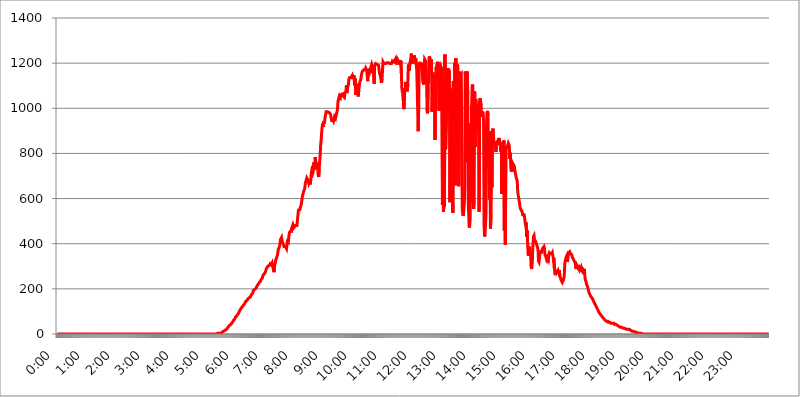
| Category | 2015.04.27. Intenzitás [W/m^2] |
|---|---|
| 0.0 | 0 |
| 0.0006944444444444445 | 0 |
| 0.001388888888888889 | 0 |
| 0.0020833333333333333 | 0 |
| 0.002777777777777778 | 0 |
| 0.003472222222222222 | 0 |
| 0.004166666666666667 | 0 |
| 0.004861111111111111 | 0 |
| 0.005555555555555556 | 0 |
| 0.0062499999999999995 | 0 |
| 0.006944444444444444 | 0 |
| 0.007638888888888889 | 0 |
| 0.008333333333333333 | 0 |
| 0.009027777777777779 | 0 |
| 0.009722222222222222 | 0 |
| 0.010416666666666666 | 0 |
| 0.011111111111111112 | 0 |
| 0.011805555555555555 | 0 |
| 0.012499999999999999 | 0 |
| 0.013194444444444444 | 0 |
| 0.013888888888888888 | 0 |
| 0.014583333333333332 | 0 |
| 0.015277777777777777 | 0 |
| 0.015972222222222224 | 0 |
| 0.016666666666666666 | 0 |
| 0.017361111111111112 | 0 |
| 0.018055555555555557 | 0 |
| 0.01875 | 0 |
| 0.019444444444444445 | 0 |
| 0.02013888888888889 | 0 |
| 0.020833333333333332 | 0 |
| 0.02152777777777778 | 0 |
| 0.022222222222222223 | 0 |
| 0.02291666666666667 | 0 |
| 0.02361111111111111 | 0 |
| 0.024305555555555556 | 0 |
| 0.024999999999999998 | 0 |
| 0.025694444444444447 | 0 |
| 0.02638888888888889 | 0 |
| 0.027083333333333334 | 0 |
| 0.027777777777777776 | 0 |
| 0.02847222222222222 | 0 |
| 0.029166666666666664 | 0 |
| 0.029861111111111113 | 0 |
| 0.030555555555555555 | 0 |
| 0.03125 | 0 |
| 0.03194444444444445 | 0 |
| 0.03263888888888889 | 0 |
| 0.03333333333333333 | 0 |
| 0.034027777777777775 | 0 |
| 0.034722222222222224 | 0 |
| 0.035416666666666666 | 0 |
| 0.036111111111111115 | 0 |
| 0.03680555555555556 | 0 |
| 0.0375 | 0 |
| 0.03819444444444444 | 0 |
| 0.03888888888888889 | 0 |
| 0.03958333333333333 | 0 |
| 0.04027777777777778 | 0 |
| 0.04097222222222222 | 0 |
| 0.041666666666666664 | 0 |
| 0.042361111111111106 | 0 |
| 0.04305555555555556 | 0 |
| 0.043750000000000004 | 0 |
| 0.044444444444444446 | 0 |
| 0.04513888888888889 | 0 |
| 0.04583333333333334 | 0 |
| 0.04652777777777778 | 0 |
| 0.04722222222222222 | 0 |
| 0.04791666666666666 | 0 |
| 0.04861111111111111 | 0 |
| 0.049305555555555554 | 0 |
| 0.049999999999999996 | 0 |
| 0.05069444444444445 | 0 |
| 0.051388888888888894 | 0 |
| 0.052083333333333336 | 0 |
| 0.05277777777777778 | 0 |
| 0.05347222222222222 | 0 |
| 0.05416666666666667 | 0 |
| 0.05486111111111111 | 0 |
| 0.05555555555555555 | 0 |
| 0.05625 | 0 |
| 0.05694444444444444 | 0 |
| 0.057638888888888885 | 0 |
| 0.05833333333333333 | 0 |
| 0.05902777777777778 | 0 |
| 0.059722222222222225 | 0 |
| 0.06041666666666667 | 0 |
| 0.061111111111111116 | 0 |
| 0.06180555555555556 | 0 |
| 0.0625 | 0 |
| 0.06319444444444444 | 0 |
| 0.06388888888888888 | 0 |
| 0.06458333333333334 | 0 |
| 0.06527777777777778 | 0 |
| 0.06597222222222222 | 0 |
| 0.06666666666666667 | 0 |
| 0.06736111111111111 | 0 |
| 0.06805555555555555 | 0 |
| 0.06874999999999999 | 0 |
| 0.06944444444444443 | 0 |
| 0.07013888888888889 | 0 |
| 0.07083333333333333 | 0 |
| 0.07152777777777779 | 0 |
| 0.07222222222222223 | 0 |
| 0.07291666666666667 | 0 |
| 0.07361111111111111 | 0 |
| 0.07430555555555556 | 0 |
| 0.075 | 0 |
| 0.07569444444444444 | 0 |
| 0.0763888888888889 | 0 |
| 0.07708333333333334 | 0 |
| 0.07777777777777778 | 0 |
| 0.07847222222222222 | 0 |
| 0.07916666666666666 | 0 |
| 0.0798611111111111 | 0 |
| 0.08055555555555556 | 0 |
| 0.08125 | 0 |
| 0.08194444444444444 | 0 |
| 0.08263888888888889 | 0 |
| 0.08333333333333333 | 0 |
| 0.08402777777777777 | 0 |
| 0.08472222222222221 | 0 |
| 0.08541666666666665 | 0 |
| 0.08611111111111112 | 0 |
| 0.08680555555555557 | 0 |
| 0.08750000000000001 | 0 |
| 0.08819444444444445 | 0 |
| 0.08888888888888889 | 0 |
| 0.08958333333333333 | 0 |
| 0.09027777777777778 | 0 |
| 0.09097222222222222 | 0 |
| 0.09166666666666667 | 0 |
| 0.09236111111111112 | 0 |
| 0.09305555555555556 | 0 |
| 0.09375 | 0 |
| 0.09444444444444444 | 0 |
| 0.09513888888888888 | 0 |
| 0.09583333333333333 | 0 |
| 0.09652777777777777 | 0 |
| 0.09722222222222222 | 0 |
| 0.09791666666666667 | 0 |
| 0.09861111111111111 | 0 |
| 0.09930555555555555 | 0 |
| 0.09999999999999999 | 0 |
| 0.10069444444444443 | 0 |
| 0.1013888888888889 | 0 |
| 0.10208333333333335 | 0 |
| 0.10277777777777779 | 0 |
| 0.10347222222222223 | 0 |
| 0.10416666666666667 | 0 |
| 0.10486111111111111 | 0 |
| 0.10555555555555556 | 0 |
| 0.10625 | 0 |
| 0.10694444444444444 | 0 |
| 0.1076388888888889 | 0 |
| 0.10833333333333334 | 0 |
| 0.10902777777777778 | 0 |
| 0.10972222222222222 | 0 |
| 0.1111111111111111 | 0 |
| 0.11180555555555556 | 0 |
| 0.11180555555555556 | 0 |
| 0.1125 | 0 |
| 0.11319444444444444 | 0 |
| 0.11388888888888889 | 0 |
| 0.11458333333333333 | 0 |
| 0.11527777777777777 | 0 |
| 0.11597222222222221 | 0 |
| 0.11666666666666665 | 0 |
| 0.1173611111111111 | 0 |
| 0.11805555555555557 | 0 |
| 0.11944444444444445 | 0 |
| 0.12013888888888889 | 0 |
| 0.12083333333333333 | 0 |
| 0.12152777777777778 | 0 |
| 0.12222222222222223 | 0 |
| 0.12291666666666667 | 0 |
| 0.12291666666666667 | 0 |
| 0.12361111111111112 | 0 |
| 0.12430555555555556 | 0 |
| 0.125 | 0 |
| 0.12569444444444444 | 0 |
| 0.12638888888888888 | 0 |
| 0.12708333333333333 | 0 |
| 0.16875 | 0 |
| 0.12847222222222224 | 0 |
| 0.12916666666666668 | 0 |
| 0.12986111111111112 | 0 |
| 0.13055555555555556 | 0 |
| 0.13125 | 0 |
| 0.13194444444444445 | 0 |
| 0.1326388888888889 | 0 |
| 0.13333333333333333 | 0 |
| 0.13402777777777777 | 0 |
| 0.13402777777777777 | 0 |
| 0.13472222222222222 | 0 |
| 0.13541666666666666 | 0 |
| 0.1361111111111111 | 0 |
| 0.13749999999999998 | 0 |
| 0.13819444444444443 | 0 |
| 0.1388888888888889 | 0 |
| 0.13958333333333334 | 0 |
| 0.14027777777777778 | 0 |
| 0.14097222222222222 | 0 |
| 0.14166666666666666 | 0 |
| 0.1423611111111111 | 0 |
| 0.14305555555555557 | 0 |
| 0.14375000000000002 | 0 |
| 0.14444444444444446 | 0 |
| 0.1451388888888889 | 0 |
| 0.1451388888888889 | 0 |
| 0.14652777777777778 | 0 |
| 0.14722222222222223 | 0 |
| 0.14791666666666667 | 0 |
| 0.1486111111111111 | 0 |
| 0.14930555555555555 | 0 |
| 0.15 | 0 |
| 0.15069444444444444 | 0 |
| 0.15138888888888888 | 0 |
| 0.15208333333333332 | 0 |
| 0.15277777777777776 | 0 |
| 0.15347222222222223 | 0 |
| 0.15416666666666667 | 0 |
| 0.15486111111111112 | 0 |
| 0.15555555555555556 | 0 |
| 0.15625 | 0 |
| 0.15694444444444444 | 0 |
| 0.15763888888888888 | 0 |
| 0.15833333333333333 | 0 |
| 0.15902777777777777 | 0 |
| 0.15972222222222224 | 0 |
| 0.16041666666666668 | 0 |
| 0.16111111111111112 | 0 |
| 0.16180555555555556 | 0 |
| 0.1625 | 0 |
| 0.16319444444444445 | 0 |
| 0.1638888888888889 | 0 |
| 0.16458333333333333 | 0 |
| 0.16527777777777777 | 0 |
| 0.16597222222222222 | 0 |
| 0.16666666666666666 | 0 |
| 0.1673611111111111 | 0 |
| 0.16805555555555554 | 0 |
| 0.16874999999999998 | 0 |
| 0.16944444444444443 | 0 |
| 0.17013888888888887 | 0 |
| 0.1708333333333333 | 0 |
| 0.17152777777777775 | 0 |
| 0.17222222222222225 | 0 |
| 0.1729166666666667 | 0 |
| 0.17361111111111113 | 0 |
| 0.17430555555555557 | 0 |
| 0.17500000000000002 | 0 |
| 0.17569444444444446 | 0 |
| 0.1763888888888889 | 0 |
| 0.17708333333333334 | 0 |
| 0.17777777777777778 | 0 |
| 0.17847222222222223 | 0 |
| 0.17916666666666667 | 0 |
| 0.1798611111111111 | 0 |
| 0.18055555555555555 | 0 |
| 0.18125 | 0 |
| 0.18194444444444444 | 0 |
| 0.1826388888888889 | 0 |
| 0.18333333333333335 | 0 |
| 0.1840277777777778 | 0 |
| 0.18472222222222223 | 0 |
| 0.18541666666666667 | 0 |
| 0.18611111111111112 | 0 |
| 0.18680555555555556 | 0 |
| 0.1875 | 0 |
| 0.18819444444444444 | 0 |
| 0.18888888888888888 | 0 |
| 0.18958333333333333 | 0 |
| 0.19027777777777777 | 0 |
| 0.1909722222222222 | 0 |
| 0.19166666666666665 | 0 |
| 0.19236111111111112 | 0 |
| 0.19305555555555554 | 0 |
| 0.19375 | 0 |
| 0.19444444444444445 | 0 |
| 0.1951388888888889 | 0 |
| 0.19583333333333333 | 0 |
| 0.19652777777777777 | 0 |
| 0.19722222222222222 | 0 |
| 0.19791666666666666 | 0 |
| 0.1986111111111111 | 0 |
| 0.19930555555555554 | 0 |
| 0.19999999999999998 | 0 |
| 0.20069444444444443 | 0 |
| 0.20138888888888887 | 0 |
| 0.2020833333333333 | 0 |
| 0.2027777777777778 | 0 |
| 0.2034722222222222 | 0 |
| 0.2041666666666667 | 0 |
| 0.20486111111111113 | 0 |
| 0.20555555555555557 | 0 |
| 0.20625000000000002 | 0 |
| 0.20694444444444446 | 0 |
| 0.2076388888888889 | 0 |
| 0.20833333333333334 | 0 |
| 0.20902777777777778 | 0 |
| 0.20972222222222223 | 0 |
| 0.21041666666666667 | 0 |
| 0.2111111111111111 | 0 |
| 0.21180555555555555 | 0 |
| 0.2125 | 0 |
| 0.21319444444444444 | 0 |
| 0.2138888888888889 | 0 |
| 0.21458333333333335 | 0 |
| 0.2152777777777778 | 0 |
| 0.21597222222222223 | 0 |
| 0.21666666666666667 | 0 |
| 0.21736111111111112 | 0 |
| 0.21805555555555556 | 0 |
| 0.21875 | 0 |
| 0.21944444444444444 | 0 |
| 0.22013888888888888 | 0 |
| 0.22083333333333333 | 0 |
| 0.22152777777777777 | 0 |
| 0.2222222222222222 | 0 |
| 0.22291666666666665 | 0 |
| 0.2236111111111111 | 3.525 |
| 0.22430555555555556 | 3.525 |
| 0.225 | 3.525 |
| 0.22569444444444445 | 3.525 |
| 0.2263888888888889 | 3.525 |
| 0.22708333333333333 | 3.525 |
| 0.22777777777777777 | 3.525 |
| 0.22847222222222222 | 3.525 |
| 0.22916666666666666 | 3.525 |
| 0.2298611111111111 | 7.887 |
| 0.23055555555555554 | 7.887 |
| 0.23124999999999998 | 7.887 |
| 0.23194444444444443 | 12.257 |
| 0.23263888888888887 | 12.257 |
| 0.2333333333333333 | 12.257 |
| 0.2340277777777778 | 12.257 |
| 0.2347222222222222 | 16.636 |
| 0.2354166666666667 | 16.636 |
| 0.23611111111111113 | 16.636 |
| 0.23680555555555557 | 21.024 |
| 0.23750000000000002 | 21.024 |
| 0.23819444444444446 | 25.419 |
| 0.2388888888888889 | 25.419 |
| 0.23958333333333334 | 29.823 |
| 0.24027777777777778 | 34.234 |
| 0.24097222222222223 | 34.234 |
| 0.24166666666666667 | 38.653 |
| 0.2423611111111111 | 38.653 |
| 0.24305555555555555 | 43.079 |
| 0.24375 | 43.079 |
| 0.24444444444444446 | 47.511 |
| 0.24513888888888888 | 47.511 |
| 0.24583333333333335 | 51.951 |
| 0.2465277777777778 | 56.398 |
| 0.24722222222222223 | 60.85 |
| 0.24791666666666667 | 60.85 |
| 0.24861111111111112 | 65.31 |
| 0.24930555555555556 | 69.775 |
| 0.25 | 74.246 |
| 0.25069444444444444 | 74.246 |
| 0.2513888888888889 | 78.722 |
| 0.2520833333333333 | 83.205 |
| 0.25277777777777777 | 83.205 |
| 0.2534722222222222 | 87.692 |
| 0.25416666666666665 | 92.184 |
| 0.2548611111111111 | 96.682 |
| 0.2555555555555556 | 101.184 |
| 0.25625000000000003 | 105.69 |
| 0.2569444444444445 | 110.201 |
| 0.2576388888888889 | 110.201 |
| 0.25833333333333336 | 114.716 |
| 0.2590277777777778 | 119.235 |
| 0.25972222222222224 | 119.235 |
| 0.2604166666666667 | 123.758 |
| 0.2611111111111111 | 128.284 |
| 0.26180555555555557 | 128.284 |
| 0.2625 | 132.814 |
| 0.26319444444444445 | 137.347 |
| 0.2638888888888889 | 141.884 |
| 0.26458333333333334 | 141.884 |
| 0.2652777777777778 | 146.423 |
| 0.2659722222222222 | 146.423 |
| 0.26666666666666666 | 150.964 |
| 0.2673611111111111 | 155.509 |
| 0.26805555555555555 | 155.509 |
| 0.26875 | 160.056 |
| 0.26944444444444443 | 160.056 |
| 0.2701388888888889 | 160.056 |
| 0.2708333333333333 | 164.605 |
| 0.27152777777777776 | 169.156 |
| 0.2722222222222222 | 173.709 |
| 0.27291666666666664 | 173.709 |
| 0.2736111111111111 | 178.264 |
| 0.2743055555555555 | 182.82 |
| 0.27499999999999997 | 191.937 |
| 0.27569444444444446 | 191.937 |
| 0.27638888888888885 | 196.497 |
| 0.27708333333333335 | 196.497 |
| 0.2777777777777778 | 196.497 |
| 0.27847222222222223 | 201.058 |
| 0.2791666666666667 | 205.62 |
| 0.2798611111111111 | 210.182 |
| 0.28055555555555556 | 214.746 |
| 0.28125 | 214.746 |
| 0.28194444444444444 | 214.746 |
| 0.2826388888888889 | 223.873 |
| 0.2833333333333333 | 228.436 |
| 0.28402777777777777 | 228.436 |
| 0.2847222222222222 | 233 |
| 0.28541666666666665 | 237.564 |
| 0.28611111111111115 | 242.127 |
| 0.28680555555555554 | 242.127 |
| 0.28750000000000003 | 246.689 |
| 0.2881944444444445 | 255.813 |
| 0.2888888888888889 | 255.813 |
| 0.28958333333333336 | 264.932 |
| 0.2902777777777778 | 264.932 |
| 0.29097222222222224 | 269.49 |
| 0.2916666666666667 | 274.047 |
| 0.2923611111111111 | 278.603 |
| 0.29305555555555557 | 287.709 |
| 0.29375 | 292.259 |
| 0.29444444444444445 | 296.808 |
| 0.2951388888888889 | 296.808 |
| 0.29583333333333334 | 301.354 |
| 0.2965277777777778 | 301.354 |
| 0.2972222222222222 | 301.354 |
| 0.29791666666666666 | 305.898 |
| 0.2986111111111111 | 310.44 |
| 0.29930555555555555 | 310.44 |
| 0.3 | 305.898 |
| 0.30069444444444443 | 310.44 |
| 0.3013888888888889 | 314.98 |
| 0.3020833333333333 | 314.98 |
| 0.30277777777777776 | 314.98 |
| 0.3034722222222222 | 278.603 |
| 0.30416666666666664 | 274.047 |
| 0.3048611111111111 | 305.898 |
| 0.3055555555555555 | 310.44 |
| 0.30624999999999997 | 324.052 |
| 0.3069444444444444 | 333.113 |
| 0.3076388888888889 | 337.639 |
| 0.30833333333333335 | 337.639 |
| 0.3090277777777778 | 351.198 |
| 0.30972222222222223 | 369.23 |
| 0.3104166666666667 | 378.224 |
| 0.3111111111111111 | 382.715 |
| 0.31180555555555556 | 387.202 |
| 0.3125 | 405.108 |
| 0.31319444444444444 | 418.492 |
| 0.3138888888888889 | 422.943 |
| 0.3145833333333333 | 427.39 |
| 0.31527777777777777 | 414.035 |
| 0.3159722222222222 | 405.108 |
| 0.31666666666666665 | 405.108 |
| 0.31736111111111115 | 396.164 |
| 0.31805555555555554 | 387.202 |
| 0.31875000000000003 | 387.202 |
| 0.3194444444444445 | 387.202 |
| 0.3201388888888889 | 387.202 |
| 0.32083333333333336 | 387.202 |
| 0.3215277777777778 | 378.224 |
| 0.32222222222222224 | 396.164 |
| 0.3229166666666667 | 414.035 |
| 0.3236111111111111 | 418.492 |
| 0.32430555555555557 | 414.035 |
| 0.325 | 436.27 |
| 0.32569444444444445 | 449.551 |
| 0.3263888888888889 | 449.551 |
| 0.32708333333333334 | 449.551 |
| 0.3277777777777778 | 458.38 |
| 0.3284722222222222 | 449.551 |
| 0.32916666666666666 | 471.582 |
| 0.3298611111111111 | 471.582 |
| 0.33055555555555555 | 484.735 |
| 0.33125 | 480.356 |
| 0.33194444444444443 | 471.582 |
| 0.3326388888888889 | 467.187 |
| 0.3333333333333333 | 471.582 |
| 0.3340277777777778 | 480.356 |
| 0.3347222222222222 | 480.356 |
| 0.3354166666666667 | 484.735 |
| 0.3361111111111111 | 480.356 |
| 0.3368055555555556 | 502.192 |
| 0.33749999999999997 | 523.88 |
| 0.33819444444444446 | 545.416 |
| 0.33888888888888885 | 553.986 |
| 0.33958333333333335 | 545.416 |
| 0.34027777777777773 | 553.986 |
| 0.34097222222222223 | 558.261 |
| 0.3416666666666666 | 558.261 |
| 0.3423611111111111 | 575.299 |
| 0.3430555555555555 | 592.233 |
| 0.34375 | 609.062 |
| 0.3444444444444445 | 604.864 |
| 0.3451388888888889 | 625.784 |
| 0.3458333333333334 | 625.784 |
| 0.34652777777777777 | 621.613 |
| 0.34722222222222227 | 646.537 |
| 0.34791666666666665 | 667.123 |
| 0.34861111111111115 | 667.123 |
| 0.34930555555555554 | 663.019 |
| 0.35000000000000003 | 691.608 |
| 0.3506944444444444 | 687.544 |
| 0.3513888888888889 | 683.473 |
| 0.3520833333333333 | 675.311 |
| 0.3527777777777778 | 667.123 |
| 0.3534722222222222 | 671.22 |
| 0.3541666666666667 | 679.395 |
| 0.3548611111111111 | 663.019 |
| 0.35555555555555557 | 683.473 |
| 0.35625 | 711.832 |
| 0.35694444444444445 | 723.889 |
| 0.3576388888888889 | 719.877 |
| 0.35833333333333334 | 711.832 |
| 0.3590277777777778 | 719.877 |
| 0.3597222222222222 | 759.723 |
| 0.36041666666666666 | 727.896 |
| 0.3611111111111111 | 735.89 |
| 0.36180555555555555 | 783.342 |
| 0.3625 | 763.674 |
| 0.36319444444444443 | 767.62 |
| 0.3638888888888889 | 755.766 |
| 0.3645833333333333 | 739.877 |
| 0.3652777777777778 | 731.896 |
| 0.3659722222222222 | 703.762 |
| 0.3666666666666667 | 695.666 |
| 0.3673611111111111 | 731.896 |
| 0.3680555555555556 | 735.89 |
| 0.36874999999999997 | 791.169 |
| 0.36944444444444446 | 837.682 |
| 0.37013888888888885 | 860.676 |
| 0.37083333333333335 | 891.099 |
| 0.37152777777777773 | 917.534 |
| 0.37222222222222223 | 932.576 |
| 0.3729166666666666 | 917.534 |
| 0.3736111111111111 | 943.832 |
| 0.3743055555555555 | 932.576 |
| 0.375 | 940.082 |
| 0.3756944444444445 | 962.555 |
| 0.3763888888888889 | 970.034 |
| 0.3770833333333334 | 984.98 |
| 0.37777777777777777 | 981.244 |
| 0.37847222222222227 | 988.714 |
| 0.37916666666666665 | 984.98 |
| 0.37986111111111115 | 988.714 |
| 0.38055555555555554 | 984.98 |
| 0.38125000000000003 | 981.244 |
| 0.3819444444444444 | 984.98 |
| 0.3826388888888889 | 977.508 |
| 0.3833333333333333 | 973.772 |
| 0.3840277777777778 | 958.814 |
| 0.3847222222222222 | 951.327 |
| 0.3854166666666667 | 940.082 |
| 0.3861111111111111 | 955.071 |
| 0.38680555555555557 | 951.327 |
| 0.3875 | 943.832 |
| 0.38819444444444445 | 947.58 |
| 0.3888888888888889 | 962.555 |
| 0.38958333333333334 | 966.295 |
| 0.3902777777777778 | 955.071 |
| 0.3909722222222222 | 955.071 |
| 0.39166666666666666 | 951.327 |
| 0.3923611111111111 | 984.98 |
| 0.39305555555555555 | 996.182 |
| 0.39375 | 1029.798 |
| 0.39444444444444443 | 1033.537 |
| 0.3951388888888889 | 1048.508 |
| 0.3958333333333333 | 1056.004 |
| 0.3965277777777778 | 1059.756 |
| 0.3972222222222222 | 1048.508 |
| 0.3979166666666667 | 1059.756 |
| 0.3986111111111111 | 1059.756 |
| 0.3993055555555556 | 1063.51 |
| 0.39999999999999997 | 1063.51 |
| 0.40069444444444446 | 1056.004 |
| 0.40138888888888885 | 1059.756 |
| 0.40208333333333335 | 1052.255 |
| 0.40277777777777773 | 1048.508 |
| 0.40347222222222223 | 1067.267 |
| 0.4041666666666666 | 1063.51 |
| 0.4048611111111111 | 1074.789 |
| 0.4055555555555555 | 1101.226 |
| 0.40625 | 1067.267 |
| 0.4069444444444445 | 1086.097 |
| 0.4076388888888889 | 1097.437 |
| 0.4083333333333334 | 1105.019 |
| 0.40902777777777777 | 1127.879 |
| 0.40972222222222227 | 1135.543 |
| 0.41041666666666665 | 1135.543 |
| 0.41111111111111115 | 1131.708 |
| 0.41180555555555554 | 1135.543 |
| 0.41250000000000003 | 1139.384 |
| 0.4131944444444444 | 1135.543 |
| 0.4138888888888889 | 1147.086 |
| 0.4145833333333333 | 1143.232 |
| 0.4152777777777778 | 1131.708 |
| 0.4159722222222222 | 1147.086 |
| 0.4166666666666667 | 1150.946 |
| 0.4173611111111111 | 1101.226 |
| 0.41805555555555557 | 1131.708 |
| 0.41875 | 1059.756 |
| 0.41944444444444445 | 1063.51 |
| 0.4201388888888889 | 1097.437 |
| 0.42083333333333334 | 1108.816 |
| 0.4215277777777778 | 1071.027 |
| 0.4222222222222222 | 1052.255 |
| 0.42291666666666666 | 1082.324 |
| 0.4236111111111111 | 1078.555 |
| 0.42430555555555555 | 1116.426 |
| 0.425 | 1112.618 |
| 0.42569444444444443 | 1127.879 |
| 0.4263888888888889 | 1143.232 |
| 0.4270833333333333 | 1154.814 |
| 0.4277777777777778 | 1162.571 |
| 0.4284722222222222 | 1166.46 |
| 0.4291666666666667 | 1166.46 |
| 0.4298611111111111 | 1170.358 |
| 0.4305555555555556 | 1174.263 |
| 0.43124999999999997 | 1174.263 |
| 0.43194444444444446 | 1170.358 |
| 0.43263888888888885 | 1178.177 |
| 0.43333333333333335 | 1178.177 |
| 0.43402777777777773 | 1170.358 |
| 0.43472222222222223 | 1170.358 |
| 0.4354166666666666 | 1120.238 |
| 0.4361111111111111 | 1162.571 |
| 0.4368055555555555 | 1143.232 |
| 0.4375 | 1170.358 |
| 0.4381944444444445 | 1154.814 |
| 0.4388888888888889 | 1178.177 |
| 0.4395833333333334 | 1158.689 |
| 0.44027777777777777 | 1186.03 |
| 0.44097222222222227 | 1193.918 |
| 0.44166666666666665 | 1186.03 |
| 0.44236111111111115 | 1189.969 |
| 0.44305555555555554 | 1166.46 |
| 0.44375000000000003 | 1170.358 |
| 0.4444444444444444 | 1108.816 |
| 0.4451388888888889 | 1189.969 |
| 0.4458333333333333 | 1193.918 |
| 0.4465277777777778 | 1197.876 |
| 0.4472222222222222 | 1197.876 |
| 0.4479166666666667 | 1201.843 |
| 0.4486111111111111 | 1193.918 |
| 0.44930555555555557 | 1189.969 |
| 0.45 | 1193.918 |
| 0.45069444444444445 | 1189.969 |
| 0.4513888888888889 | 1170.358 |
| 0.45208333333333334 | 1154.814 |
| 0.4527777777777778 | 1150.946 |
| 0.4534722222222222 | 1139.384 |
| 0.45416666666666666 | 1120.238 |
| 0.4548611111111111 | 1112.618 |
| 0.45555555555555555 | 1131.708 |
| 0.45625 | 1170.358 |
| 0.45694444444444443 | 1205.82 |
| 0.4576388888888889 | 1205.82 |
| 0.4583333333333333 | 1197.876 |
| 0.4590277777777778 | 1197.876 |
| 0.4597222222222222 | 1197.876 |
| 0.4604166666666667 | 1197.876 |
| 0.4611111111111111 | 1197.876 |
| 0.4618055555555556 | 1201.843 |
| 0.46249999999999997 | 1201.843 |
| 0.46319444444444446 | 1201.843 |
| 0.46388888888888885 | 1201.843 |
| 0.46458333333333335 | 1201.843 |
| 0.46527777777777773 | 1201.843 |
| 0.46597222222222223 | 1197.876 |
| 0.4666666666666666 | 1197.876 |
| 0.4673611111111111 | 1193.918 |
| 0.4680555555555555 | 1193.918 |
| 0.46875 | 1197.876 |
| 0.4694444444444445 | 1201.843 |
| 0.4701388888888889 | 1209.807 |
| 0.4708333333333334 | 1209.807 |
| 0.47152777777777777 | 1209.807 |
| 0.47222222222222227 | 1205.82 |
| 0.47291666666666665 | 1209.807 |
| 0.47361111111111115 | 1209.807 |
| 0.47430555555555554 | 1217.812 |
| 0.47500000000000003 | 1217.812 |
| 0.4756944444444444 | 1213.804 |
| 0.4763888888888889 | 1193.918 |
| 0.4770833333333333 | 1217.812 |
| 0.4777777777777778 | 1221.83 |
| 0.4784722222222222 | 1213.804 |
| 0.4791666666666667 | 1205.82 |
| 0.4798611111111111 | 1193.918 |
| 0.48055555555555557 | 1213.804 |
| 0.48125 | 1201.843 |
| 0.48194444444444445 | 1209.807 |
| 0.4826388888888889 | 1154.814 |
| 0.48333333333333334 | 1089.873 |
| 0.4840277777777778 | 1071.027 |
| 0.4847222222222222 | 1078.555 |
| 0.48541666666666666 | 1033.537 |
| 0.4861111111111111 | 996.182 |
| 0.48680555555555555 | 1029.798 |
| 0.4875 | 1089.873 |
| 0.48819444444444443 | 1082.324 |
| 0.4888888888888889 | 1116.426 |
| 0.4895833333333333 | 1108.816 |
| 0.4902777777777778 | 1097.437 |
| 0.4909722222222222 | 1074.789 |
| 0.4916666666666667 | 1108.816 |
| 0.4923611111111111 | 1186.03 |
| 0.4930555555555556 | 1193.918 |
| 0.49374999999999997 | 1166.46 |
| 0.49444444444444446 | 1197.876 |
| 0.49513888888888885 | 1201.843 |
| 0.49583333333333335 | 1217.812 |
| 0.49652777777777773 | 1242.089 |
| 0.49722222222222223 | 1221.83 |
| 0.4979166666666666 | 1209.807 |
| 0.4986111111111111 | 1197.876 |
| 0.4993055555555555 | 1193.918 |
| 0.5 | 1225.859 |
| 0.5006944444444444 | 1233.951 |
| 0.5013888888888889 | 1221.83 |
| 0.5020833333333333 | 1213.804 |
| 0.5027777777777778 | 1221.83 |
| 0.5034722222222222 | 1225.859 |
| 0.5041666666666667 | 1174.263 |
| 0.5048611111111111 | 1086.097 |
| 0.5055555555555555 | 992.448 |
| 0.50625 | 898.668 |
| 0.5069444444444444 | 1011.118 |
| 0.5076388888888889 | 1174.263 |
| 0.5083333333333333 | 1205.82 |
| 0.5090277777777777 | 1186.03 |
| 0.5097222222222222 | 1178.177 |
| 0.5104166666666666 | 1178.177 |
| 0.5111111111111112 | 1201.843 |
| 0.5118055555555555 | 1201.843 |
| 0.5125000000000001 | 1201.843 |
| 0.5131944444444444 | 1112.618 |
| 0.513888888888889 | 1105.019 |
| 0.5145833333333333 | 1178.177 |
| 0.5152777777777778 | 1217.812 |
| 0.5159722222222222 | 1221.83 |
| 0.5166666666666667 | 1209.807 |
| 0.517361111111111 | 1162.571 |
| 0.5180555555555556 | 1112.618 |
| 0.5187499999999999 | 988.714 |
| 0.5194444444444445 | 977.508 |
| 0.5201388888888888 | 1097.437 |
| 0.5208333333333334 | 1124.056 |
| 0.5215277777777778 | 1229.899 |
| 0.5222222222222223 | 1229.899 |
| 0.5229166666666667 | 1221.83 |
| 0.5236111111111111 | 1178.177 |
| 0.5243055555555556 | 1217.812 |
| 0.525 | 1174.263 |
| 0.5256944444444445 | 984.98 |
| 0.5263888888888889 | 1086.097 |
| 0.5270833333333333 | 1158.689 |
| 0.5277777777777778 | 1082.324 |
| 0.5284722222222222 | 1071.027 |
| 0.5291666666666667 | 1101.226 |
| 0.5298611111111111 | 860.676 |
| 0.5305555555555556 | 1033.537 |
| 0.53125 | 1182.099 |
| 0.5319444444444444 | 1174.263 |
| 0.5326388888888889 | 1193.918 |
| 0.5333333333333333 | 1193.918 |
| 0.5340277777777778 | 1205.82 |
| 0.5347222222222222 | 1131.708 |
| 0.5354166666666667 | 988.714 |
| 0.5361111111111111 | 1178.177 |
| 0.5368055555555555 | 1182.099 |
| 0.5375 | 1189.969 |
| 0.5381944444444444 | 1186.03 |
| 0.5388888888888889 | 1178.177 |
| 0.5395833333333333 | 1182.099 |
| 0.5402777777777777 | 571.049 |
| 0.5409722222222222 | 1143.232 |
| 0.5416666666666666 | 541.121 |
| 0.5423611111111112 | 579.542 |
| 0.5430555555555555 | 562.53 |
| 0.5437500000000001 | 1238.014 |
| 0.5444444444444444 | 818.392 |
| 0.545138888888889 | 826.123 |
| 0.5458333333333333 | 928.819 |
| 0.5465277777777778 | 1178.177 |
| 0.5472222222222222 | 1162.571 |
| 0.5479166666666667 | 1178.177 |
| 0.548611111111111 | 1037.277 |
| 0.5493055555555556 | 1170.358 |
| 0.5499999999999999 | 1143.232 |
| 0.5506944444444445 | 583.779 |
| 0.5513888888888888 | 1086.097 |
| 0.5520833333333334 | 1048.508 |
| 0.5527777777777778 | 853.029 |
| 0.5534722222222223 | 609.062 |
| 0.5541666666666667 | 634.105 |
| 0.5548611111111111 | 536.82 |
| 0.5555555555555556 | 1120.238 |
| 0.55625 | 747.834 |
| 0.5569444444444445 | 671.22 |
| 0.5576388888888889 | 1201.843 |
| 0.5583333333333333 | 658.909 |
| 0.5590277777777778 | 1221.83 |
| 0.5597222222222222 | 1018.587 |
| 0.5604166666666667 | 849.199 |
| 0.5611111111111111 | 1193.918 |
| 0.5618055555555556 | 1186.03 |
| 0.5625 | 977.508 |
| 0.5631944444444444 | 654.791 |
| 0.5638888888888889 | 1097.437 |
| 0.5645833333333333 | 1162.571 |
| 0.5652777777777778 | 1139.384 |
| 0.5659722222222222 | 1139.384 |
| 0.5666666666666667 | 1147.086 |
| 0.5673611111111111 | 1143.232 |
| 0.5680555555555555 | 553.986 |
| 0.56875 | 532.513 |
| 0.5694444444444444 | 523.88 |
| 0.5701388888888889 | 549.704 |
| 0.5708333333333333 | 571.049 |
| 0.5715277777777777 | 658.909 |
| 0.5722222222222222 | 1162.571 |
| 0.5729166666666666 | 1131.708 |
| 0.5736111111111112 | 759.723 |
| 0.5743055555555555 | 928.819 |
| 0.5750000000000001 | 1162.571 |
| 0.5756944444444444 | 1059.756 |
| 0.576388888888889 | 596.45 |
| 0.5770833333333333 | 528.2 |
| 0.5777777777777778 | 471.582 |
| 0.5784722222222222 | 480.356 |
| 0.5791666666666667 | 510.885 |
| 0.579861111111111 | 932.576 |
| 0.5805555555555556 | 583.779 |
| 0.5812499999999999 | 1014.852 |
| 0.5819444444444445 | 1097.437 |
| 0.5826388888888888 | 1105.019 |
| 0.5833333333333334 | 583.779 |
| 0.5840277777777778 | 553.986 |
| 0.5847222222222223 | 592.233 |
| 0.5854166666666667 | 1074.789 |
| 0.5861111111111111 | 829.981 |
| 0.5868055555555556 | 1041.019 |
| 0.5875 | 1026.06 |
| 0.5881944444444445 | 1011.118 |
| 0.5888888888888889 | 1011.118 |
| 0.5895833333333333 | 1014.852 |
| 0.5902777777777778 | 1011.118 |
| 0.5909722222222222 | 883.516 |
| 0.5916666666666667 | 541.121 |
| 0.5923611111111111 | 1029.798 |
| 0.5930555555555556 | 1044.762 |
| 0.59375 | 1041.019 |
| 0.5944444444444444 | 1011.118 |
| 0.5951388888888889 | 970.034 |
| 0.5958333333333333 | 962.555 |
| 0.5965277777777778 | 984.98 |
| 0.5972222222222222 | 977.508 |
| 0.5979166666666667 | 947.58 |
| 0.5986111111111111 | 484.735 |
| 0.5993055555555555 | 431.833 |
| 0.6 | 440.702 |
| 0.6006944444444444 | 489.108 |
| 0.6013888888888889 | 532.513 |
| 0.6020833333333333 | 928.819 |
| 0.6027777777777777 | 981.244 |
| 0.6034722222222222 | 988.714 |
| 0.6041666666666666 | 970.034 |
| 0.6048611111111112 | 751.803 |
| 0.6055555555555555 | 719.877 |
| 0.6062500000000001 | 596.45 |
| 0.6069444444444444 | 898.668 |
| 0.607638888888889 | 467.187 |
| 0.6083333333333333 | 528.2 |
| 0.6090277777777778 | 691.608 |
| 0.6097222222222222 | 650.667 |
| 0.6104166666666667 | 898.668 |
| 0.611111111111111 | 909.996 |
| 0.6118055555555556 | 875.918 |
| 0.6124999999999999 | 853.029 |
| 0.6131944444444445 | 849.199 |
| 0.6138888888888888 | 845.365 |
| 0.6145833333333334 | 837.682 |
| 0.6152777777777778 | 806.757 |
| 0.6159722222222223 | 845.365 |
| 0.6166666666666667 | 849.199 |
| 0.6173611111111111 | 853.029 |
| 0.6180555555555556 | 837.682 |
| 0.61875 | 853.029 |
| 0.6194444444444445 | 868.305 |
| 0.6201388888888889 | 868.305 |
| 0.6208333333333333 | 849.199 |
| 0.6215277777777778 | 845.365 |
| 0.6222222222222222 | 806.757 |
| 0.6229166666666667 | 833.834 |
| 0.6236111111111111 | 621.613 |
| 0.6243055555555556 | 814.519 |
| 0.625 | 849.199 |
| 0.6256944444444444 | 650.667 |
| 0.6263888888888889 | 856.855 |
| 0.6270833333333333 | 458.38 |
| 0.6277777777777778 | 814.519 |
| 0.6284722222222222 | 396.164 |
| 0.6291666666666667 | 814.519 |
| 0.6298611111111111 | 822.26 |
| 0.6305555555555555 | 818.392 |
| 0.63125 | 829.981 |
| 0.6319444444444444 | 837.682 |
| 0.6326388888888889 | 845.365 |
| 0.6333333333333333 | 845.365 |
| 0.6340277777777777 | 833.834 |
| 0.6347222222222222 | 775.492 |
| 0.6354166666666666 | 802.868 |
| 0.6361111111111112 | 798.974 |
| 0.6368055555555555 | 719.877 |
| 0.6375000000000001 | 727.896 |
| 0.6381944444444444 | 719.877 |
| 0.638888888888889 | 755.766 |
| 0.6395833333333333 | 755.766 |
| 0.6402777777777778 | 751.803 |
| 0.6409722222222222 | 743.859 |
| 0.6416666666666667 | 727.896 |
| 0.642361111111111 | 715.858 |
| 0.6430555555555556 | 703.762 |
| 0.6437499999999999 | 691.608 |
| 0.6444444444444445 | 687.544 |
| 0.6451388888888888 | 679.395 |
| 0.6458333333333334 | 629.948 |
| 0.6465277777777778 | 629.948 |
| 0.6472222222222223 | 600.661 |
| 0.6479166666666667 | 588.009 |
| 0.6486111111111111 | 575.299 |
| 0.6493055555555556 | 558.261 |
| 0.65 | 553.986 |
| 0.6506944444444445 | 549.704 |
| 0.6513888888888889 | 545.416 |
| 0.6520833333333333 | 541.121 |
| 0.6527777777777778 | 528.2 |
| 0.6534722222222222 | 523.88 |
| 0.6541666666666667 | 523.88 |
| 0.6548611111111111 | 528.2 |
| 0.6555555555555556 | 532.513 |
| 0.65625 | 528.2 |
| 0.6569444444444444 | 480.356 |
| 0.6576388888888889 | 493.475 |
| 0.6583333333333333 | 431.833 |
| 0.6590277777777778 | 458.38 |
| 0.6597222222222222 | 405.108 |
| 0.6604166666666667 | 351.198 |
| 0.6611111111111111 | 346.682 |
| 0.6618055555555555 | 387.202 |
| 0.6625 | 378.224 |
| 0.6631944444444444 | 364.728 |
| 0.6638888888888889 | 360.221 |
| 0.6645833333333333 | 301.354 |
| 0.6652777777777777 | 287.709 |
| 0.6659722222222222 | 287.709 |
| 0.6666666666666666 | 360.221 |
| 0.6673611111111111 | 405.108 |
| 0.6680555555555556 | 431.833 |
| 0.6687500000000001 | 436.27 |
| 0.6694444444444444 | 418.492 |
| 0.6701388888888888 | 418.492 |
| 0.6708333333333334 | 409.574 |
| 0.6715277777777778 | 405.108 |
| 0.6722222222222222 | 396.164 |
| 0.6729166666666666 | 391.685 |
| 0.6736111111111112 | 382.715 |
| 0.6743055555555556 | 373.729 |
| 0.6749999999999999 | 324.052 |
| 0.6756944444444444 | 319.517 |
| 0.6763888888888889 | 337.639 |
| 0.6770833333333334 | 369.23 |
| 0.6777777777777777 | 364.728 |
| 0.6784722222222223 | 355.712 |
| 0.6791666666666667 | 364.728 |
| 0.6798611111111111 | 369.23 |
| 0.6805555555555555 | 378.224 |
| 0.68125 | 378.224 |
| 0.6819444444444445 | 378.224 |
| 0.6826388888888889 | 387.202 |
| 0.6833333333333332 | 378.224 |
| 0.6840277777777778 | 351.198 |
| 0.6847222222222222 | 351.198 |
| 0.6854166666666667 | 342.162 |
| 0.686111111111111 | 333.113 |
| 0.6868055555555556 | 337.639 |
| 0.6875 | 328.584 |
| 0.6881944444444444 | 333.113 |
| 0.688888888888889 | 328.584 |
| 0.6895833333333333 | 351.198 |
| 0.6902777777777778 | 360.221 |
| 0.6909722222222222 | 360.221 |
| 0.6916666666666668 | 355.712 |
| 0.6923611111111111 | 355.712 |
| 0.6930555555555555 | 355.712 |
| 0.69375 | 355.712 |
| 0.6944444444444445 | 360.221 |
| 0.6951388888888889 | 360.221 |
| 0.6958333333333333 | 333.113 |
| 0.6965277777777777 | 337.639 |
| 0.6972222222222223 | 292.259 |
| 0.6979166666666666 | 269.49 |
| 0.6986111111111111 | 260.373 |
| 0.6993055555555556 | 269.49 |
| 0.7000000000000001 | 274.047 |
| 0.7006944444444444 | 274.047 |
| 0.7013888888888888 | 274.047 |
| 0.7020833333333334 | 283.156 |
| 0.7027777777777778 | 274.047 |
| 0.7034722222222222 | 269.49 |
| 0.7041666666666666 | 283.156 |
| 0.7048611111111112 | 255.813 |
| 0.7055555555555556 | 251.251 |
| 0.7062499999999999 | 242.127 |
| 0.7069444444444444 | 237.564 |
| 0.7076388888888889 | 233 |
| 0.7083333333333334 | 228.436 |
| 0.7090277777777777 | 233 |
| 0.7097222222222223 | 237.564 |
| 0.7104166666666667 | 246.689 |
| 0.7111111111111111 | 255.813 |
| 0.7118055555555555 | 310.44 |
| 0.7125 | 324.052 |
| 0.7131944444444445 | 333.113 |
| 0.7138888888888889 | 342.162 |
| 0.7145833333333332 | 346.682 |
| 0.7152777777777778 | 319.517 |
| 0.7159722222222222 | 328.584 |
| 0.7166666666666667 | 351.198 |
| 0.717361111111111 | 360.221 |
| 0.7180555555555556 | 360.221 |
| 0.71875 | 364.728 |
| 0.7194444444444444 | 360.221 |
| 0.720138888888889 | 355.712 |
| 0.7208333333333333 | 355.712 |
| 0.7215277777777778 | 351.198 |
| 0.7222222222222222 | 342.162 |
| 0.7229166666666668 | 337.639 |
| 0.7236111111111111 | 333.113 |
| 0.7243055555555555 | 328.584 |
| 0.725 | 324.052 |
| 0.7256944444444445 | 319.517 |
| 0.7263888888888889 | 314.98 |
| 0.7270833333333333 | 296.808 |
| 0.7277777777777777 | 287.709 |
| 0.7284722222222223 | 305.898 |
| 0.7291666666666666 | 301.354 |
| 0.7298611111111111 | 296.808 |
| 0.7305555555555556 | 305.898 |
| 0.7312500000000001 | 296.808 |
| 0.7319444444444444 | 296.808 |
| 0.7326388888888888 | 283.156 |
| 0.7333333333333334 | 287.709 |
| 0.7340277777777778 | 292.259 |
| 0.7347222222222222 | 296.808 |
| 0.7354166666666666 | 287.709 |
| 0.7361111111111112 | 292.259 |
| 0.7368055555555556 | 292.259 |
| 0.7374999999999999 | 287.709 |
| 0.7381944444444444 | 264.932 |
| 0.7388888888888889 | 287.709 |
| 0.7395833333333334 | 278.603 |
| 0.7402777777777777 | 246.689 |
| 0.7409722222222223 | 237.564 |
| 0.7416666666666667 | 233 |
| 0.7423611111111111 | 219.309 |
| 0.7430555555555555 | 214.746 |
| 0.74375 | 210.182 |
| 0.7444444444444445 | 201.058 |
| 0.7451388888888889 | 191.937 |
| 0.7458333333333332 | 182.82 |
| 0.7465277777777778 | 178.264 |
| 0.7472222222222222 | 173.709 |
| 0.7479166666666667 | 169.156 |
| 0.748611111111111 | 164.605 |
| 0.7493055555555556 | 164.605 |
| 0.75 | 160.056 |
| 0.7506944444444444 | 155.509 |
| 0.751388888888889 | 150.964 |
| 0.7520833333333333 | 146.423 |
| 0.7527777777777778 | 141.884 |
| 0.7534722222222222 | 137.347 |
| 0.7541666666666668 | 132.814 |
| 0.7548611111111111 | 128.284 |
| 0.7555555555555555 | 123.758 |
| 0.75625 | 119.235 |
| 0.7569444444444445 | 114.716 |
| 0.7576388888888889 | 110.201 |
| 0.7583333333333333 | 105.69 |
| 0.7590277777777777 | 101.184 |
| 0.7597222222222223 | 96.682 |
| 0.7604166666666666 | 92.184 |
| 0.7611111111111111 | 92.184 |
| 0.7618055555555556 | 87.692 |
| 0.7625000000000001 | 83.205 |
| 0.7631944444444444 | 83.205 |
| 0.7638888888888888 | 78.722 |
| 0.7645833333333334 | 74.246 |
| 0.7652777777777778 | 74.246 |
| 0.7659722222222222 | 69.775 |
| 0.7666666666666666 | 69.775 |
| 0.7673611111111112 | 65.31 |
| 0.7680555555555556 | 65.31 |
| 0.7687499999999999 | 60.85 |
| 0.7694444444444444 | 60.85 |
| 0.7701388888888889 | 56.398 |
| 0.7708333333333334 | 56.398 |
| 0.7715277777777777 | 56.398 |
| 0.7722222222222223 | 56.398 |
| 0.7729166666666667 | 51.951 |
| 0.7736111111111111 | 51.951 |
| 0.7743055555555555 | 51.951 |
| 0.775 | 51.951 |
| 0.7756944444444445 | 51.951 |
| 0.7763888888888889 | 47.511 |
| 0.7770833333333332 | 47.511 |
| 0.7777777777777778 | 47.511 |
| 0.7784722222222222 | 47.511 |
| 0.7791666666666667 | 47.511 |
| 0.779861111111111 | 47.511 |
| 0.7805555555555556 | 47.511 |
| 0.78125 | 43.079 |
| 0.7819444444444444 | 43.079 |
| 0.782638888888889 | 43.079 |
| 0.7833333333333333 | 43.079 |
| 0.7840277777777778 | 38.653 |
| 0.7847222222222222 | 38.653 |
| 0.7854166666666668 | 38.653 |
| 0.7861111111111111 | 38.653 |
| 0.7868055555555555 | 34.234 |
| 0.7875 | 34.234 |
| 0.7881944444444445 | 34.234 |
| 0.7888888888888889 | 29.823 |
| 0.7895833333333333 | 29.823 |
| 0.7902777777777777 | 29.823 |
| 0.7909722222222223 | 29.823 |
| 0.7916666666666666 | 29.823 |
| 0.7923611111111111 | 29.823 |
| 0.7930555555555556 | 25.419 |
| 0.7937500000000001 | 25.419 |
| 0.7944444444444444 | 25.419 |
| 0.7951388888888888 | 25.419 |
| 0.7958333333333334 | 25.419 |
| 0.7965277777777778 | 25.419 |
| 0.7972222222222222 | 21.024 |
| 0.7979166666666666 | 21.024 |
| 0.7986111111111112 | 21.024 |
| 0.7993055555555556 | 21.024 |
| 0.7999999999999999 | 21.024 |
| 0.8006944444444444 | 21.024 |
| 0.8013888888888889 | 21.024 |
| 0.8020833333333334 | 21.024 |
| 0.8027777777777777 | 21.024 |
| 0.8034722222222223 | 21.024 |
| 0.8041666666666667 | 16.636 |
| 0.8048611111111111 | 16.636 |
| 0.8055555555555555 | 16.636 |
| 0.80625 | 12.257 |
| 0.8069444444444445 | 12.257 |
| 0.8076388888888889 | 12.257 |
| 0.8083333333333332 | 12.257 |
| 0.8090277777777778 | 12.257 |
| 0.8097222222222222 | 12.257 |
| 0.8104166666666667 | 7.887 |
| 0.811111111111111 | 7.887 |
| 0.8118055555555556 | 7.887 |
| 0.8125 | 7.887 |
| 0.8131944444444444 | 3.525 |
| 0.813888888888889 | 3.525 |
| 0.8145833333333333 | 3.525 |
| 0.8152777777777778 | 3.525 |
| 0.8159722222222222 | 3.525 |
| 0.8166666666666668 | 3.525 |
| 0.8173611111111111 | 3.525 |
| 0.8180555555555555 | 3.525 |
| 0.81875 | 3.525 |
| 0.8194444444444445 | 3.525 |
| 0.8201388888888889 | 3.525 |
| 0.8208333333333333 | 0 |
| 0.8215277777777777 | 0 |
| 0.8222222222222223 | 0 |
| 0.8229166666666666 | 0 |
| 0.8236111111111111 | 0 |
| 0.8243055555555556 | 0 |
| 0.8250000000000001 | 0 |
| 0.8256944444444444 | 0 |
| 0.8263888888888888 | 0 |
| 0.8270833333333334 | 0 |
| 0.8277777777777778 | 0 |
| 0.8284722222222222 | 0 |
| 0.8291666666666666 | 0 |
| 0.8298611111111112 | 0 |
| 0.8305555555555556 | 0 |
| 0.8312499999999999 | 0 |
| 0.8319444444444444 | 0 |
| 0.8326388888888889 | 0 |
| 0.8333333333333334 | 0 |
| 0.8340277777777777 | 0 |
| 0.8347222222222223 | 0 |
| 0.8354166666666667 | 0 |
| 0.8361111111111111 | 0 |
| 0.8368055555555555 | 0 |
| 0.8375 | 0 |
| 0.8381944444444445 | 0 |
| 0.8388888888888889 | 0 |
| 0.8395833333333332 | 0 |
| 0.8402777777777778 | 0 |
| 0.8409722222222222 | 0 |
| 0.8416666666666667 | 0 |
| 0.842361111111111 | 0 |
| 0.8430555555555556 | 0 |
| 0.84375 | 0 |
| 0.8444444444444444 | 0 |
| 0.845138888888889 | 0 |
| 0.8458333333333333 | 0 |
| 0.8465277777777778 | 0 |
| 0.8472222222222222 | 0 |
| 0.8479166666666668 | 0 |
| 0.8486111111111111 | 0 |
| 0.8493055555555555 | 0 |
| 0.85 | 0 |
| 0.8506944444444445 | 0 |
| 0.8513888888888889 | 0 |
| 0.8520833333333333 | 0 |
| 0.8527777777777777 | 0 |
| 0.8534722222222223 | 0 |
| 0.8541666666666666 | 0 |
| 0.8548611111111111 | 0 |
| 0.8555555555555556 | 0 |
| 0.8562500000000001 | 0 |
| 0.8569444444444444 | 0 |
| 0.8576388888888888 | 0 |
| 0.8583333333333334 | 0 |
| 0.8590277777777778 | 0 |
| 0.8597222222222222 | 0 |
| 0.8604166666666666 | 0 |
| 0.8611111111111112 | 0 |
| 0.8618055555555556 | 0 |
| 0.8624999999999999 | 0 |
| 0.8631944444444444 | 0 |
| 0.8638888888888889 | 0 |
| 0.8645833333333334 | 0 |
| 0.8652777777777777 | 0 |
| 0.8659722222222223 | 0 |
| 0.8666666666666667 | 0 |
| 0.8673611111111111 | 0 |
| 0.8680555555555555 | 0 |
| 0.86875 | 0 |
| 0.8694444444444445 | 0 |
| 0.8701388888888889 | 0 |
| 0.8708333333333332 | 0 |
| 0.8715277777777778 | 0 |
| 0.8722222222222222 | 0 |
| 0.8729166666666667 | 0 |
| 0.873611111111111 | 0 |
| 0.8743055555555556 | 0 |
| 0.875 | 0 |
| 0.8756944444444444 | 0 |
| 0.876388888888889 | 0 |
| 0.8770833333333333 | 0 |
| 0.8777777777777778 | 0 |
| 0.8784722222222222 | 0 |
| 0.8791666666666668 | 0 |
| 0.8798611111111111 | 0 |
| 0.8805555555555555 | 0 |
| 0.88125 | 0 |
| 0.8819444444444445 | 0 |
| 0.8826388888888889 | 0 |
| 0.8833333333333333 | 0 |
| 0.8840277777777777 | 0 |
| 0.8847222222222223 | 0 |
| 0.8854166666666666 | 0 |
| 0.8861111111111111 | 0 |
| 0.8868055555555556 | 0 |
| 0.8875000000000001 | 0 |
| 0.8881944444444444 | 0 |
| 0.8888888888888888 | 0 |
| 0.8895833333333334 | 0 |
| 0.8902777777777778 | 0 |
| 0.8909722222222222 | 0 |
| 0.8916666666666666 | 0 |
| 0.8923611111111112 | 0 |
| 0.8930555555555556 | 0 |
| 0.8937499999999999 | 0 |
| 0.8944444444444444 | 0 |
| 0.8951388888888889 | 0 |
| 0.8958333333333334 | 0 |
| 0.8965277777777777 | 0 |
| 0.8972222222222223 | 0 |
| 0.8979166666666667 | 0 |
| 0.8986111111111111 | 0 |
| 0.8993055555555555 | 0 |
| 0.9 | 0 |
| 0.9006944444444445 | 0 |
| 0.9013888888888889 | 0 |
| 0.9020833333333332 | 0 |
| 0.9027777777777778 | 0 |
| 0.9034722222222222 | 0 |
| 0.9041666666666667 | 0 |
| 0.904861111111111 | 0 |
| 0.9055555555555556 | 0 |
| 0.90625 | 0 |
| 0.9069444444444444 | 0 |
| 0.907638888888889 | 0 |
| 0.9083333333333333 | 0 |
| 0.9090277777777778 | 0 |
| 0.9097222222222222 | 0 |
| 0.9104166666666668 | 0 |
| 0.9111111111111111 | 0 |
| 0.9118055555555555 | 0 |
| 0.9125 | 0 |
| 0.9131944444444445 | 0 |
| 0.9138888888888889 | 0 |
| 0.9145833333333333 | 0 |
| 0.9152777777777777 | 0 |
| 0.9159722222222223 | 0 |
| 0.9166666666666666 | 0 |
| 0.9173611111111111 | 0 |
| 0.9180555555555556 | 0 |
| 0.9187500000000001 | 0 |
| 0.9194444444444444 | 0 |
| 0.9201388888888888 | 0 |
| 0.9208333333333334 | 0 |
| 0.9215277777777778 | 0 |
| 0.9222222222222222 | 0 |
| 0.9229166666666666 | 0 |
| 0.9236111111111112 | 0 |
| 0.9243055555555556 | 0 |
| 0.9249999999999999 | 0 |
| 0.9256944444444444 | 0 |
| 0.9263888888888889 | 0 |
| 0.9270833333333334 | 0 |
| 0.9277777777777777 | 0 |
| 0.9284722222222223 | 0 |
| 0.9291666666666667 | 0 |
| 0.9298611111111111 | 0 |
| 0.9305555555555555 | 0 |
| 0.93125 | 0 |
| 0.9319444444444445 | 0 |
| 0.9326388888888889 | 0 |
| 0.9333333333333332 | 0 |
| 0.9340277777777778 | 0 |
| 0.9347222222222222 | 0 |
| 0.9354166666666667 | 0 |
| 0.936111111111111 | 0 |
| 0.9368055555555556 | 0 |
| 0.9375 | 0 |
| 0.9381944444444444 | 0 |
| 0.938888888888889 | 0 |
| 0.9395833333333333 | 0 |
| 0.9402777777777778 | 0 |
| 0.9409722222222222 | 0 |
| 0.9416666666666668 | 0 |
| 0.9423611111111111 | 0 |
| 0.9430555555555555 | 0 |
| 0.94375 | 0 |
| 0.9444444444444445 | 0 |
| 0.9451388888888889 | 0 |
| 0.9458333333333333 | 0 |
| 0.9465277777777777 | 0 |
| 0.9472222222222223 | 0 |
| 0.9479166666666666 | 0 |
| 0.9486111111111111 | 0 |
| 0.9493055555555556 | 0 |
| 0.9500000000000001 | 0 |
| 0.9506944444444444 | 0 |
| 0.9513888888888888 | 0 |
| 0.9520833333333334 | 0 |
| 0.9527777777777778 | 0 |
| 0.9534722222222222 | 0 |
| 0.9541666666666666 | 0 |
| 0.9548611111111112 | 0 |
| 0.9555555555555556 | 0 |
| 0.9562499999999999 | 0 |
| 0.9569444444444444 | 0 |
| 0.9576388888888889 | 0 |
| 0.9583333333333334 | 0 |
| 0.9590277777777777 | 0 |
| 0.9597222222222223 | 0 |
| 0.9604166666666667 | 0 |
| 0.9611111111111111 | 0 |
| 0.9618055555555555 | 0 |
| 0.9625 | 0 |
| 0.9631944444444445 | 0 |
| 0.9638888888888889 | 0 |
| 0.9645833333333332 | 0 |
| 0.9652777777777778 | 0 |
| 0.9659722222222222 | 0 |
| 0.9666666666666667 | 0 |
| 0.967361111111111 | 0 |
| 0.9680555555555556 | 0 |
| 0.96875 | 0 |
| 0.9694444444444444 | 0 |
| 0.970138888888889 | 0 |
| 0.9708333333333333 | 0 |
| 0.9715277777777778 | 0 |
| 0.9722222222222222 | 0 |
| 0.9729166666666668 | 0 |
| 0.9736111111111111 | 0 |
| 0.9743055555555555 | 0 |
| 0.975 | 0 |
| 0.9756944444444445 | 0 |
| 0.9763888888888889 | 0 |
| 0.9770833333333333 | 0 |
| 0.9777777777777777 | 0 |
| 0.9784722222222223 | 0 |
| 0.9791666666666666 | 0 |
| 0.9798611111111111 | 0 |
| 0.9805555555555556 | 0 |
| 0.9812500000000001 | 0 |
| 0.9819444444444444 | 0 |
| 0.9826388888888888 | 0 |
| 0.9833333333333334 | 0 |
| 0.9840277777777778 | 0 |
| 0.9847222222222222 | 0 |
| 0.9854166666666666 | 0 |
| 0.9861111111111112 | 0 |
| 0.9868055555555556 | 0 |
| 0.9874999999999999 | 0 |
| 0.9881944444444444 | 0 |
| 0.9888888888888889 | 0 |
| 0.9895833333333334 | 0 |
| 0.9902777777777777 | 0 |
| 0.9909722222222223 | 0 |
| 0.9916666666666667 | 0 |
| 0.9923611111111111 | 0 |
| 0.9930555555555555 | 0 |
| 0.99375 | 0 |
| 0.9944444444444445 | 0 |
| 0.9951388888888889 | 0 |
| 0.9958333333333332 | 0 |
| 0.9965277777777778 | 0 |
| 0.9972222222222222 | 0 |
| 0.9979166666666667 | 0 |
| 0.998611111111111 | 0 |
| 0.9993055555555556 | 0 |